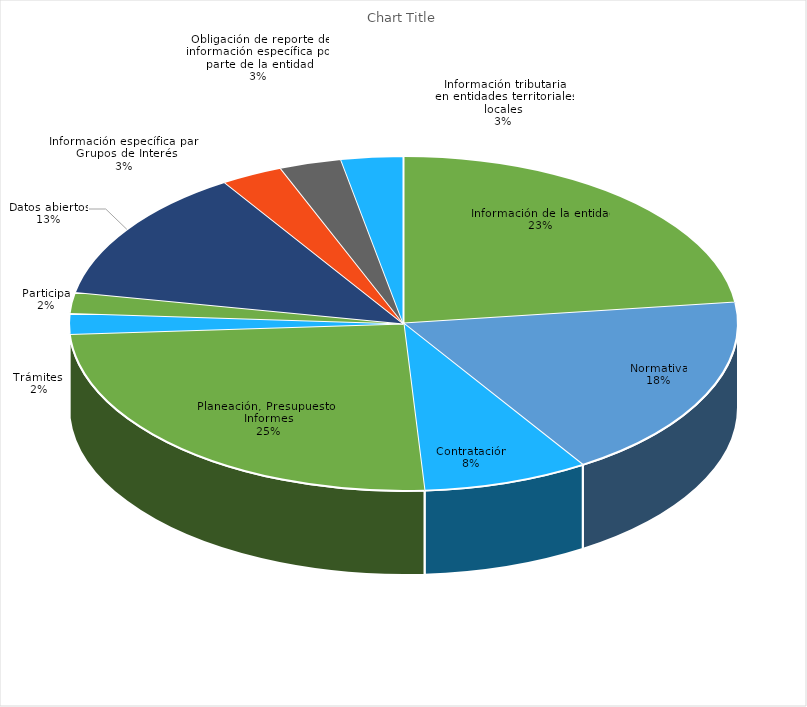
| Category | Series 0 |
|---|---|
| Información de la entidad | 0.23 |
| Normativa | 0.18 |
| Contratación | 0.08 |
| Planeación, Presupuesto e Informes | 0.25 |
| Trámites  | 0.02 |
| Participa | 0.02 |
| Datos abiertos | 0.13 |
| Información específica para Grupos de Interés | 0.03 |
| Obligación de reporte de información específica por parte de la entidad | 0.03 |
| Información tributaria
en entidades territoriales
locales_x000d_ | 0.03 |